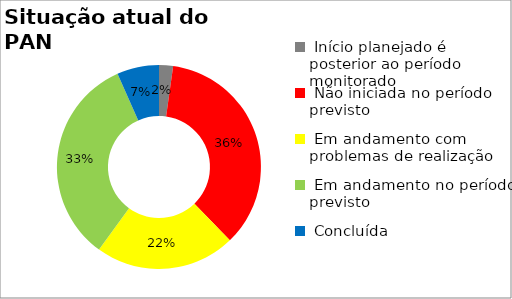
| Category | Series 0 |
|---|---|
|  Início planejado é posterior ao período monitorado | 0.022 |
|  Não iniciada no período previsto | 0.356 |
|  Em andamento com problemas de realização | 0.222 |
|  Em andamento no período previsto  | 0.333 |
|  Concluída | 0.067 |